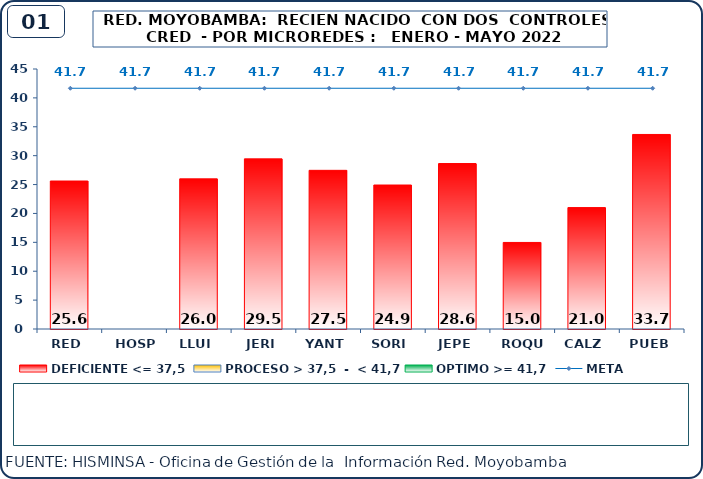
| Category | DEFICIENTE <= 37,5 | PROCESO > 37,5  -  < 41,7 | OPTIMO >= 41,7 |
|---|---|---|---|
| RED | 25.61 | 0 | 0 |
| HOSP | 0 | 0 | 0 |
| LLUI | 26 | 0 | 0 |
| JERI | 29.46 | 0 | 0 |
| YANT | 27.46 | 0 | 0 |
| SORI | 24.92 | 0 | 0 |
| JEPE | 28.64 | 0 | 0 |
| ROQU | 14.98 | 0 | 0 |
| CALZ | 21.02 | 0 | 0 |
| PUEB | 33.67 | 0 | 0 |